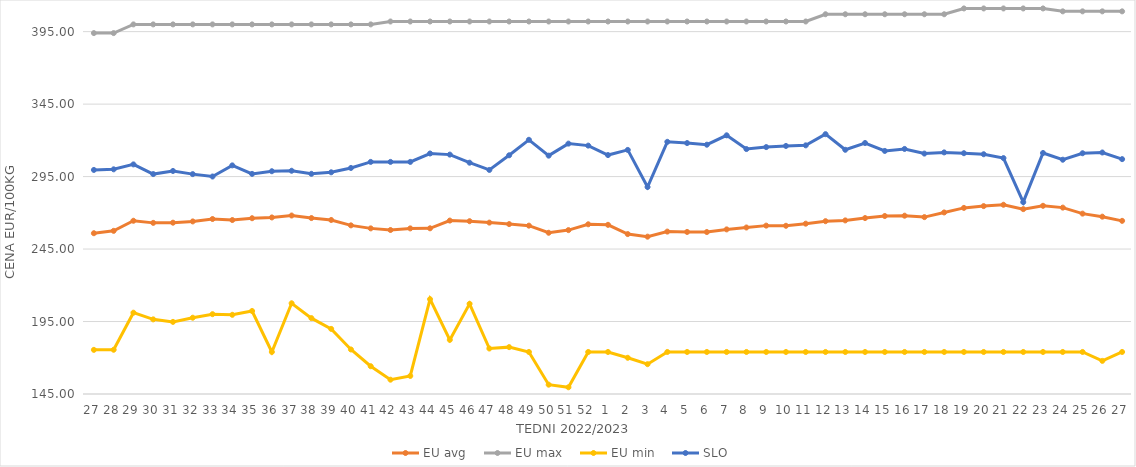
| Category | EU avg | EU max | EU min | SLO |
|---|---|---|---|---|
| 27.0 | 255.922 | 394 | 175.451 | 299.59 |
| 28.0 | 257.564 | 394 | 175.52 | 300.01 |
| 29.0 | 264.52 | 400 | 201.097 | 303.41 |
| 30.0 | 263.067 | 400 | 196.496 | 296.73 |
| 31.0 | 263.196 | 400 | 194.756 | 298.88 |
| 32.0 | 264.059 | 400 | 197.634 | 296.7 |
| 33.0 | 265.729 | 400 | 200.07 | 295.05 |
| 34.0 | 265.016 | 400 | 199.637 | 302.73 |
| 35.0 | 266.273 | 400 | 202.277 | 296.86 |
| 36.0 | 266.807 | 400 | 174 | 298.7 |
| 37.0 | 268.136 | 400 | 207.594 | 299.02 |
| 38.0 | 266.39 | 400 | 197.352 | 296.91 |
| 39.0 | 265.059 | 400 | 189.926 | 297.96 |
| 40.0 | 261.35 | 400 | 175.723 | 300.95 |
| 41.0 | 259.271 | 400 | 164.165 | 305.13 |
| 42.0 | 258.146 | 402 | 154.869 | 305.13 |
| 43.0 | 259.256 | 402 | 157.459 | 305.13 |
| 44.0 | 259.32 | 402 | 210.415 | 310.93 |
| 45.0 | 264.649 | 402 | 182.35 | 310.16 |
| 46.0 | 264.228 | 402 | 207.247 | 304.58 |
| 47.0 | 263.24 | 402 | 176.378 | 299.59 |
| 48.0 | 262.225 | 402 | 177.332 | 309.69 |
| 49.0 | 261.152 | 402 | 174 | 320.38 |
| 50.0 | 256.24 | 402 | 151.434 | 309.44 |
| 51.0 | 258.071 | 402 | 149.638 | 317.74 |
| 52.0 | 262.088 | 402 | 174 | 316.36 |
| 1.0 | 261.716 | 402 | 174 | 309.84 |
| 2.0 | 255.331 | 402 | 169.983 | 313.4 |
| 3.0 | 253.546 | 402 | 165.574 | 287.81 |
| 4.0 | 257.051 | 402 | 174 | 318.98 |
| 5.0 | 256.808 | 402 | 174 | 318.13 |
| 6.0 | 256.75 | 402 | 174 | 316.99 |
| 7.0 | 258.565 | 402 | 174 | 323.47 |
| 8.0 | 259.872 | 402 | 174 | 314 |
| 9.0 | 261.164 | 402 | 174 | 315.35 |
| 10.0 | 261.06 | 402 | 174 | 316.13 |
| 11.0 | 262.513 | 402 | 174 | 316.55 |
| 12.0 | 264.228 | 407 | 174 | 324.27 |
| 13.0 | 264.768 | 407 | 174 | 313.49 |
| 14.0 | 266.385 | 407 | 174 | 318.17 |
| 15.0 | 267.797 | 407 | 174 | 312.7 |
| 16.0 | 268.021 | 407 | 174 | 314.07 |
| 17.0 | 267.041 | 407 | 174 | 310.87 |
| 18.0 | 270.255 | 407 | 174 | 311.69 |
| 19.0 | 273.406 | 411 | 174 | 311.13 |
| 20.0 | 274.631 | 411 | 174 | 310.42 |
| 21.0 | 275.561 | 411 | 174 | 307.76 |
| 22.0 | 272.542 | 411 | 174 | 277.34 |
| 23.0 | 274.85 | 411 | 174 | 311.28 |
| 24.0 | 273.59 | 409 | 174 | 306.64 |
| 25.0 | 269.439 | 409 | 174 | 311.1 |
| 26.0 | 267.345 | 409 | 167.858 | 311.62 |
| 27.0 | 264.458 | 409 | 174 | 307.04 |